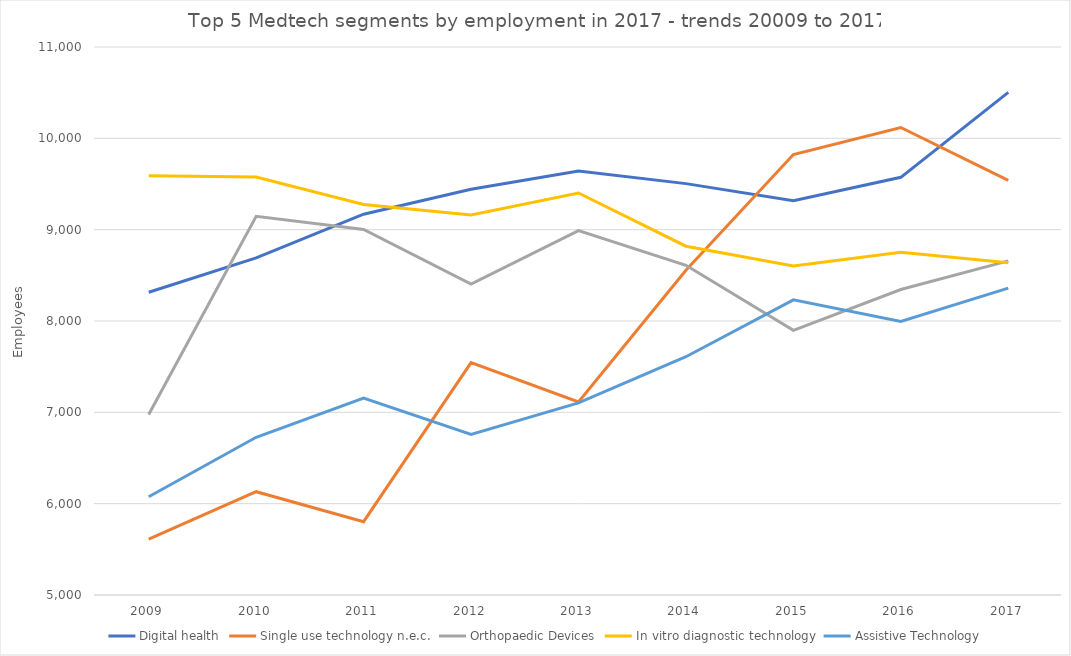
| Category |  Digital health  |  Single use technology n.e.c.  |  Orthopaedic Devices  |  In vitro diagnostic technology  |  Assistive Technology  |
|---|---|---|---|---|---|
|  2009  | 8315 | 5612 | 6977 | 9590 | 6076 |
|  2010  | 8691 | 6131 | 9146 | 9577 | 6727 |
|  2011  | 9169 | 5803 | 9002 | 9275 | 7157 |
|  2012  | 9442 | 7544 | 8405 | 9162 | 6758 |
|  2013  | 9641 | 7114 | 8989 | 9402 | 7103 |
|  2014  | 9504 | 8555 | 8610 | 8819 | 7609 |
|  2015  | 9316 | 9823 | 7897 | 8602 | 8232 |
|  2016  | 9573 | 10119 | 8345 | 8752 | 7996 |
|  2017  | 10504 | 9539 | 8658 | 8638 | 8360 |